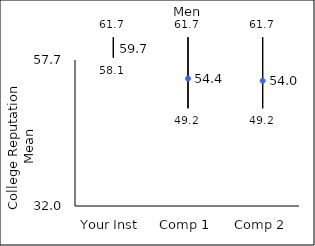
| Category | 25th percentile | 75th percentile | Mean |
|---|---|---|---|
| Your Inst | 58.1 | 61.7 | 59.68 |
| Comp 1 | 49.2 | 61.7 | 54.43 |
| Comp 2 | 49.2 | 61.7 | 54.04 |